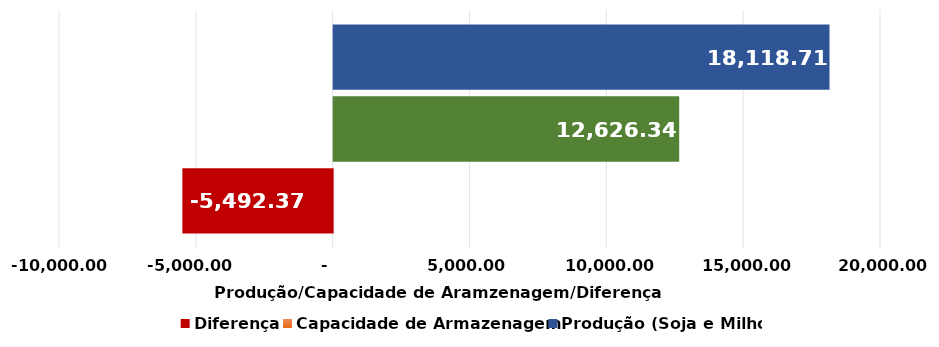
| Category | Diferença | Capacidade de Armazenagem | Produção (Soja e Milho) |
|---|---|---|---|
| 0 | -5492370 | 12626343 | 18118713 |